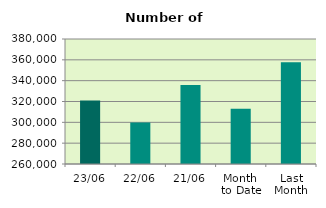
| Category | Series 0 |
|---|---|
| 23/06 | 320924 |
| 22/06 | 299864 |
| 21/06 | 335764 |
| Month 
to Date | 313047.882 |
| Last
Month | 357760.286 |